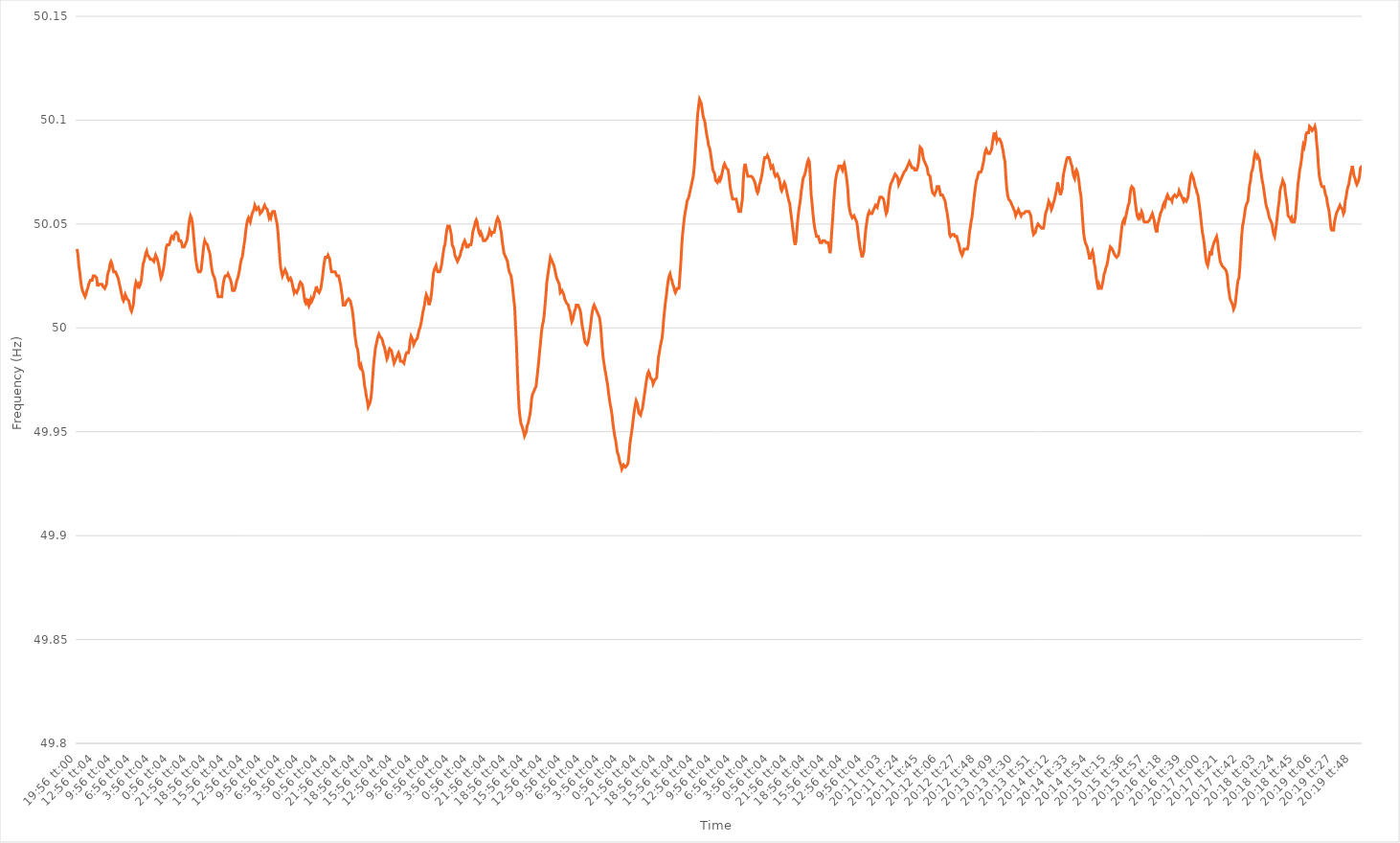
| Category | Series 0 |
|---|---|
| 0.8305555555555556 | 50.038 |
| 0.8305671296296296 | 50.035 |
| 0.8305787037037037 | 50.03 |
| 0.8305902777777777 | 50.027 |
| 0.8306018518518519 | 50.023 |
| 0.872268518518518 | 50.02 |
| 0.913935185185185 | 50.018 |
| 0.955601851851852 | 50.017 |
| 0.997268518518518 | 50.016 |
| 1900-01-01 00:56:04 | 50.015 |
| 1900-01-01 01:56:04 | 50.016 |
| 1900-01-01 02:56:04 | 50.018 |
| 1900-01-01 03:56:04 | 50.019 |
| 1900-01-01 04:56:04 | 50.021 |
| 1900-01-01 05:56:04 | 50.022 |
| 1900-01-01 06:56:04 | 50.023 |
| 1900-01-01 07:56:04 | 50.023 |
| 1900-01-01 08:56:04 | 50.023 |
| 1900-01-01 09:56:04 | 50.025 |
| 1900-01-01 10:56:04 | 50.025 |
| 1900-01-01 11:56:04 | 50.025 |
| 1900-01-01 12:56:04 | 50.025 |
| 1900-01-01 13:56:04 | 50.024 |
| 1900-01-01 14:56:04 | 50.02 |
| 1900-01-01 15:56:04 | 50.021 |
| 1900-01-01 16:56:04 | 50.021 |
| 1900-01-01 17:56:04 | 50.021 |
| 1900-01-01 18:56:04 | 50.021 |
| 1900-01-01 19:56:04 | 50.021 |
| 1900-01-01 20:56:04 | 50.02 |
| 1900-01-01 21:56:04 | 50.02 |
| 1900-01-01 22:56:04 | 50.019 |
| 1900-01-01 23:56:04 | 50.02 |
| 1900-01-02 00:56:04 | 50.021 |
| 1900-01-02 01:56:04 | 50.025 |
| 1900-01-02 02:56:04 | 50.027 |
| 1900-01-02 03:56:04 | 50.028 |
| 1900-01-02 04:56:04 | 50.031 |
| 1900-01-02 05:56:04 | 50.032 |
| 1900-01-02 06:56:04 | 50.031 |
| 1900-01-02 07:56:04 | 50.029 |
| 1900-01-02 08:56:04 | 50.027 |
| 1900-01-02 09:56:04 | 50.027 |
| 1900-01-02 10:56:04 | 50.027 |
| 1900-01-02 11:56:04 | 50.026 |
| 1900-01-02 12:56:04 | 50.025 |
| 1900-01-02 13:56:04 | 50.024 |
| 1900-01-02 14:56:04 | 50.022 |
| 1900-01-02 15:56:04 | 50.02 |
| 1900-01-02 16:56:04 | 50.018 |
| 1900-01-02 17:56:04 | 50.016 |
| 1900-01-02 18:56:04 | 50.014 |
| 1900-01-02 19:56:04 | 50.013 |
| 1900-01-02 20:56:04 | 50.014 |
| 1900-01-02 21:56:04 | 50.016 |
| 1900-01-02 22:56:04 | 50.015 |
| 1900-01-02 23:56:04 | 50.014 |
| 1900-01-03 00:56:04 | 50.014 |
| 1900-01-03 01:56:04 | 50.013 |
| 1900-01-03 02:56:04 | 50.011 |
| 1900-01-03 03:56:04 | 50.009 |
| 1900-01-03 04:56:04 | 50.008 |
| 1900-01-03 05:56:04 | 50.008 |
| 1900-01-03 06:56:04 | 50.011 |
| 1900-01-03 07:56:04 | 50.016 |
| 1900-01-03 08:56:04 | 50.02 |
| 1900-01-03 09:56:04 | 50.022 |
| 1900-01-03 10:56:04 | 50.022 |
| 1900-01-03 11:56:04 | 50.02 |
| 1900-01-03 12:56:04 | 50.021 |
| 1900-01-03 13:56:04 | 50.02 |
| 1900-01-03 14:56:04 | 50.021 |
| 1900-01-03 15:56:04 | 50.023 |
| 1900-01-03 16:56:04 | 50.027 |
| 1900-01-03 17:56:04 | 50.031 |
| 1900-01-03 18:56:04 | 50.032 |
| 1900-01-03 19:56:04 | 50.034 |
| 1900-01-03 20:56:04 | 50.036 |
| 1900-01-03 21:56:04 | 50.037 |
| 1900-01-03 22:56:04 | 50.035 |
| 1900-01-03 23:56:04 | 50.035 |
| 1900-01-04 00:56:04 | 50.034 |
| 1900-01-04 01:56:04 | 50.033 |
| 1900-01-04 02:56:04 | 50.033 |
| 1900-01-04 03:56:04 | 50.033 |
| 1900-01-04 04:56:04 | 50.033 |
| 1900-01-04 05:56:04 | 50.032 |
| 1900-01-04 06:56:04 | 50.032 |
| 1900-01-04 07:56:04 | 50.035 |
| 1900-01-04 08:56:04 | 50.034 |
| 1900-01-04 09:56:04 | 50.033 |
| 1900-01-04 10:56:04 | 50.031 |
| 1900-01-04 11:56:04 | 50.029 |
| 1900-01-04 12:56:04 | 50.026 |
| 1900-01-04 13:56:04 | 50.024 |
| 1900-01-04 14:56:04 | 50.025 |
| 1900-01-04 15:56:04 | 50.027 |
| 1900-01-04 16:56:04 | 50.029 |
| 1900-01-04 17:56:04 | 50.032 |
| 1900-01-04 18:56:04 | 50.036 |
| 1900-01-04 19:56:04 | 50.039 |
| 1900-01-04 20:56:04 | 50.04 |
| 1900-01-04 21:56:04 | 50.04 |
| 1900-01-04 22:56:04 | 50.04 |
| 1900-01-04 23:56:04 | 50.041 |
| 1900-01-05 00:56:04 | 50.043 |
| 1900-01-05 01:56:04 | 50.044 |
| 1900-01-05 02:56:04 | 50.044 |
| 1900-01-05 03:56:04 | 50.043 |
| 1900-01-05 04:56:04 | 50.045 |
| 1900-01-05 05:56:04 | 50.045 |
| 1900-01-05 06:56:04 | 50.046 |
| 1900-01-05 07:56:04 | 50.046 |
| 1900-01-05 08:56:04 | 50.045 |
| 1900-01-05 09:56:04 | 50.042 |
| 1900-01-05 10:56:04 | 50.042 |
| 1900-01-05 11:56:04 | 50.042 |
| 1900-01-05 12:56:04 | 50.041 |
| 1900-01-05 13:56:04 | 50.039 |
| 1900-01-05 14:56:04 | 50.039 |
| 1900-01-05 15:56:04 | 50.039 |
| 1900-01-05 16:56:04 | 50.039 |
| 1900-01-05 17:56:04 | 50.041 |
| 1900-01-05 18:56:04 | 50.042 |
| 1900-01-05 19:56:04 | 50.045 |
| 1900-01-05 20:56:04 | 50.049 |
| 1900-01-05 21:56:04 | 50.052 |
| 1900-01-05 22:56:04 | 50.054 |
| 1900-01-05 23:56:04 | 50.053 |
| 1900-01-06 00:56:04 | 50.051 |
| 1900-01-06 01:56:04 | 50.047 |
| 1900-01-06 02:56:04 | 50.042 |
| 1900-01-06 03:56:04 | 50.037 |
| 1900-01-06 04:56:04 | 50.033 |
| 1900-01-06 05:56:04 | 50.03 |
| 1900-01-06 06:56:04 | 50.028 |
| 1900-01-06 07:56:04 | 50.027 |
| 1900-01-06 08:56:04 | 50.027 |
| 1900-01-06 09:56:04 | 50.027 |
| 1900-01-06 10:56:04 | 50.028 |
| 1900-01-06 11:56:04 | 50.032 |
| 1900-01-06 12:56:04 | 50.036 |
| 1900-01-06 13:56:04 | 50.04 |
| 1900-01-06 14:56:04 | 50.042 |
| 1900-01-06 15:56:04 | 50.041 |
| 1900-01-06 16:56:04 | 50.041 |
| 1900-01-06 17:56:04 | 50.04 |
| 1900-01-06 18:56:04 | 50.038 |
| 1900-01-06 19:56:04 | 50.037 |
| 1900-01-06 20:56:04 | 50.035 |
| 1900-01-06 21:56:04 | 50.031 |
| 1900-01-06 22:56:04 | 50.028 |
| 1900-01-06 23:56:04 | 50.026 |
| 1900-01-07 00:56:04 | 50.026 |
| 1900-01-07 01:56:04 | 50.024 |
| 1900-01-07 02:56:04 | 50.022 |
| 1900-01-07 03:56:04 | 50.019 |
| 1900-01-07 04:56:04 | 50.017 |
| 1900-01-07 05:56:04 | 50.015 |
| 1900-01-07 06:56:04 | 50.015 |
| 1900-01-07 07:56:04 | 50.015 |
| 1900-01-07 08:56:04 | 50.015 |
| 1900-01-07 09:56:04 | 50.015 |
| 1900-01-07 10:56:04 | 50.019 |
| 1900-01-07 11:56:04 | 50.022 |
| 1900-01-07 12:56:04 | 50.024 |
| 1900-01-07 13:56:04 | 50.025 |
| 1900-01-07 14:56:04 | 50.025 |
| 1900-01-07 15:56:04 | 50.025 |
| 1900-01-07 16:56:04 | 50.026 |
| 1900-01-07 17:56:04 | 50.025 |
| 1900-01-07 18:56:04 | 50.024 |
| 1900-01-07 19:56:04 | 50.023 |
| 1900-01-07 20:56:04 | 50.021 |
| 1900-01-07 21:56:04 | 50.018 |
| 1900-01-07 22:56:04 | 50.018 |
| 1900-01-07 23:56:04 | 50.018 |
| 1900-01-08 00:56:04 | 50.019 |
| 1900-01-08 01:56:04 | 50.021 |
| 1900-01-08 02:56:04 | 50.023 |
| 1900-01-08 03:56:04 | 50.024 |
| 1900-01-08 04:56:04 | 50.026 |
| 1900-01-08 05:56:04 | 50.028 |
| 1900-01-08 06:56:04 | 50.031 |
| 1900-01-08 07:56:04 | 50.033 |
| 1900-01-08 08:56:04 | 50.034 |
| 1900-01-08 09:56:04 | 50.037 |
| 1900-01-08 10:56:04 | 50.04 |
| 1900-01-08 11:56:04 | 50.043 |
| 1900-01-08 12:56:04 | 50.047 |
| 1900-01-08 13:56:04 | 50.05 |
| 1900-01-08 14:56:04 | 50.052 |
| 1900-01-08 15:56:04 | 50.053 |
| 1900-01-08 16:56:04 | 50.052 |
| 1900-01-08 17:56:04 | 50.051 |
| 1900-01-08 18:56:04 | 50.053 |
| 1900-01-08 19:56:04 | 50.055 |
| 1900-01-08 20:56:04 | 50.056 |
| 1900-01-08 21:56:04 | 50.057 |
| 1900-01-08 22:56:04 | 50.059 |
| 1900-01-08 23:56:04 | 50.058 |
| 1900-01-09 00:56:04 | 50.057 |
| 1900-01-09 01:56:04 | 50.057 |
| 1900-01-09 02:56:04 | 50.058 |
| 1900-01-09 03:56:04 | 50.057 |
| 1900-01-09 04:56:04 | 50.055 |
| 1900-01-09 05:56:04 | 50.055 |
| 1900-01-09 06:56:04 | 50.056 |
| 1900-01-09 07:56:04 | 50.057 |
| 1900-01-09 08:56:04 | 50.058 |
| 1900-01-09 09:56:04 | 50.059 |
| 1900-01-09 10:56:04 | 50.058 |
| 1900-01-09 11:56:04 | 50.058 |
| 1900-01-09 12:56:04 | 50.057 |
| 1900-01-09 13:56:04 | 50.055 |
| 1900-01-09 14:56:04 | 50.053 |
| 1900-01-09 15:56:04 | 50.054 |
| 1900-01-09 16:56:04 | 50.053 |
| 1900-01-09 17:56:04 | 50.055 |
| 1900-01-09 18:56:04 | 50.056 |
| 1900-01-09 19:56:04 | 50.056 |
| 1900-01-09 20:56:04 | 50.056 |
| 1900-01-09 21:56:04 | 50.054 |
| 1900-01-09 22:56:04 | 50.052 |
| 1900-01-09 23:56:04 | 50.05 |
| 1900-01-10 00:56:04 | 50.046 |
| 1900-01-10 01:56:04 | 50.04 |
| 1900-01-10 02:56:04 | 50.034 |
| 1900-01-10 03:56:04 | 50.029 |
| 1900-01-10 04:56:04 | 50.027 |
| 1900-01-10 05:56:04 | 50.025 |
| 1900-01-10 06:56:04 | 50.025 |
| 1900-01-10 07:56:04 | 50.027 |
| 1900-01-10 08:56:04 | 50.028 |
| 1900-01-10 09:56:04 | 50.027 |
| 1900-01-10 10:56:04 | 50.026 |
| 1900-01-10 11:56:04 | 50.024 |
| 1900-01-10 12:56:04 | 50.023 |
| 1900-01-10 13:56:04 | 50.023 |
| 1900-01-10 14:56:04 | 50.024 |
| 1900-01-10 15:56:04 | 50.023 |
| 1900-01-10 16:56:04 | 50.021 |
| 1900-01-10 17:56:04 | 50.019 |
| 1900-01-10 18:56:04 | 50.017 |
| 1900-01-10 19:56:04 | 50.018 |
| 1900-01-10 20:56:04 | 50.018 |
| 1900-01-10 21:56:04 | 50.017 |
| 1900-01-10 22:56:04 | 50.017 |
| 1900-01-10 23:56:04 | 50.019 |
| 1900-01-11 00:56:04 | 50.021 |
| 1900-01-11 01:56:04 | 50.022 |
| 1900-01-11 02:56:04 | 50.022 |
| 1900-01-11 03:56:04 | 50.021 |
| 1900-01-11 04:56:04 | 50.019 |
| 1900-01-11 05:56:04 | 50.016 |
| 1900-01-11 06:56:04 | 50.013 |
| 1900-01-11 07:56:04 | 50.012 |
| 1900-01-11 08:56:04 | 50.013 |
| 1900-01-11 09:56:04 | 50.012 |
| 1900-01-11 10:56:04 | 50.014 |
| 1900-01-11 11:56:04 | 50.011 |
| 1900-01-11 12:56:04 | 50.012 |
| 1900-01-11 13:56:04 | 50.014 |
| 1900-01-11 14:56:04 | 50.013 |
| 1900-01-11 15:56:04 | 50.014 |
| 1900-01-11 16:56:04 | 50.015 |
| 1900-01-11 17:56:04 | 50.017 |
| 1900-01-11 18:56:04 | 50.018 |
| 1900-01-11 19:56:04 | 50.02 |
| 1900-01-11 20:56:04 | 50.018 |
| 1900-01-11 21:56:04 | 50.018 |
| 1900-01-11 22:56:04 | 50.017 |
| 1900-01-11 23:56:04 | 50.018 |
| 1900-01-12 00:56:04 | 50.019 |
| 1900-01-12 01:56:04 | 50.022 |
| 1900-01-12 02:56:04 | 50.025 |
| 1900-01-12 03:56:04 | 50.029 |
| 1900-01-12 04:56:04 | 50.032 |
| 1900-01-12 05:56:04 | 50.034 |
| 1900-01-12 06:56:04 | 50.034 |
| 1900-01-12 07:56:04 | 50.034 |
| 1900-01-12 08:56:04 | 50.035 |
| 1900-01-12 09:56:04 | 50.034 |
| 1900-01-12 10:56:04 | 50.033 |
| 1900-01-12 11:56:04 | 50.029 |
| 1900-01-12 12:56:04 | 50.027 |
| 1900-01-12 13:56:04 | 50.027 |
| 1900-01-12 14:56:04 | 50.027 |
| 1900-01-12 15:56:04 | 50.027 |
| 1900-01-12 16:56:04 | 50.027 |
| 1900-01-12 17:56:04 | 50.026 |
| 1900-01-12 18:56:04 | 50.025 |
| 1900-01-12 19:56:04 | 50.025 |
| 1900-01-12 20:56:04 | 50.025 |
| 1900-01-12 21:56:04 | 50.023 |
| 1900-01-12 22:56:04 | 50.021 |
| 1900-01-12 23:56:04 | 50.018 |
| 1900-01-13 00:56:04 | 50.015 |
| 1900-01-13 01:56:04 | 50.011 |
| 1900-01-13 02:56:04 | 50.011 |
| 1900-01-13 03:56:04 | 50.011 |
| 1900-01-13 04:56:04 | 50.012 |
| 1900-01-13 05:56:04 | 50.013 |
| 1900-01-13 06:56:04 | 50.013 |
| 1900-01-13 07:56:04 | 50.014 |
| 1900-01-13 08:56:04 | 50.014 |
| 1900-01-13 09:56:04 | 50.013 |
| 1900-01-13 10:56:04 | 50.011 |
| 1900-01-13 11:56:04 | 50.009 |
| 1900-01-13 12:56:04 | 50.006 |
| 1900-01-13 13:56:04 | 50.002 |
| 1900-01-13 14:56:04 | 49.997 |
| 1900-01-13 15:56:04 | 49.994 |
| 1900-01-13 16:56:04 | 49.991 |
| 1900-01-13 17:56:04 | 49.99 |
| 1900-01-13 18:56:04 | 49.987 |
| 1900-01-13 19:56:04 | 49.982 |
| 1900-01-13 20:56:04 | 49.981 |
| 1900-01-13 21:56:04 | 49.982 |
| 1900-01-13 22:56:04 | 49.98 |
| 1900-01-13 23:56:04 | 49.979 |
| 1900-01-14 00:56:04 | 49.976 |
| 1900-01-14 01:56:04 | 49.972 |
| 1900-01-14 02:56:04 | 49.97 |
| 1900-01-14 03:56:04 | 49.967 |
| 1900-01-14 04:56:04 | 49.965 |
| 1900-01-14 05:56:04 | 49.962 |
| 1900-01-14 06:56:04 | 49.962 |
| 1900-01-14 07:56:04 | 49.964 |
| 1900-01-14 08:56:04 | 49.966 |
| 1900-01-14 09:56:04 | 49.97 |
| 1900-01-14 10:56:04 | 49.976 |
| 1900-01-14 11:56:04 | 49.982 |
| 1900-01-14 12:56:04 | 49.986 |
| 1900-01-14 13:56:04 | 49.99 |
| 1900-01-14 14:56:04 | 49.992 |
| 1900-01-14 15:56:04 | 49.994 |
| 1900-01-14 16:56:04 | 49.996 |
| 1900-01-14 17:56:04 | 49.997 |
| 1900-01-14 18:56:04 | 49.996 |
| 1900-01-14 19:56:04 | 49.996 |
| 1900-01-14 20:56:04 | 49.995 |
| 1900-01-14 21:56:04 | 49.994 |
| 1900-01-14 22:56:04 | 49.992 |
| 1900-01-14 23:56:04 | 49.991 |
| 1900-01-15 00:56:04 | 49.989 |
| 1900-01-15 01:56:04 | 49.987 |
| 1900-01-15 02:56:04 | 49.985 |
| 1900-01-15 03:56:04 | 49.986 |
| 1900-01-15 04:56:04 | 49.989 |
| 1900-01-15 05:56:04 | 49.99 |
| 1900-01-15 06:56:04 | 49.99 |
| 1900-01-15 07:56:04 | 49.989 |
| 1900-01-15 08:56:04 | 49.987 |
| 1900-01-15 09:56:04 | 49.985 |
| 1900-01-15 10:56:04 | 49.983 |
| 1900-01-15 11:56:04 | 49.984 |
| 1900-01-15 12:56:04 | 49.985 |
| 1900-01-15 13:56:04 | 49.985 |
| 1900-01-15 14:56:04 | 49.987 |
| 1900-01-15 15:56:04 | 49.988 |
| 1900-01-15 16:56:04 | 49.987 |
| 1900-01-15 17:56:04 | 49.984 |
| 1900-01-15 18:56:04 | 49.984 |
| 1900-01-15 19:56:04 | 49.984 |
| 1900-01-15 20:56:04 | 49.984 |
| 1900-01-15 21:56:04 | 49.983 |
| 1900-01-15 22:56:04 | 49.985 |
| 1900-01-15 23:56:04 | 49.987 |
| 1900-01-16 00:56:04 | 49.988 |
| 1900-01-16 01:56:04 | 49.988 |
| 1900-01-16 02:56:04 | 49.988 |
| 1900-01-16 03:56:04 | 49.99 |
| 1900-01-16 04:56:04 | 49.994 |
| 1900-01-16 05:56:04 | 49.996 |
| 1900-01-16 06:56:04 | 49.995 |
| 1900-01-16 07:56:04 | 49.994 |
| 1900-01-16 08:56:04 | 49.992 |
| 1900-01-16 09:56:04 | 49.992 |
| 1900-01-16 10:56:04 | 49.994 |
| 1900-01-16 11:56:04 | 49.994 |
| 1900-01-16 12:56:04 | 49.995 |
| 1900-01-16 13:56:04 | 49.997 |
| 1900-01-16 14:56:04 | 49.999 |
| 1900-01-16 15:56:04 | 50 |
| 1900-01-16 16:56:04 | 50.002 |
| 1900-01-16 17:56:04 | 50.004 |
| 1900-01-16 18:56:04 | 50.007 |
| 1900-01-16 19:56:04 | 50.009 |
| 1900-01-16 20:56:04 | 50.011 |
| 1900-01-16 21:56:04 | 50.014 |
| 1900-01-16 22:56:04 | 50.016 |
| 1900-01-16 23:56:04 | 50.015 |
| 1900-01-17 00:56:04 | 50.014 |
| 1900-01-17 01:56:04 | 50.011 |
| 1900-01-17 02:56:04 | 50.011 |
| 1900-01-17 03:56:04 | 50.014 |
| 1900-01-17 04:56:04 | 50.017 |
| 1900-01-17 05:56:04 | 50.022 |
| 1900-01-17 06:56:04 | 50.026 |
| 1900-01-17 07:56:04 | 50.028 |
| 1900-01-17 08:56:04 | 50.029 |
| 1900-01-17 09:56:04 | 50.03 |
| 1900-01-17 10:56:04 | 50.028 |
| 1900-01-17 11:56:04 | 50.027 |
| 1900-01-17 12:56:04 | 50.027 |
| 1900-01-17 13:56:04 | 50.027 |
| 1900-01-17 14:56:04 | 50.028 |
| 1900-01-17 15:56:04 | 50.03 |
| 1900-01-17 16:56:04 | 50.033 |
| 1900-01-17 17:56:04 | 50.036 |
| 1900-01-17 18:56:04 | 50.039 |
| 1900-01-17 19:56:04 | 50.04 |
| 1900-01-17 20:56:04 | 50.044 |
| 1900-01-17 21:56:04 | 50.047 |
| 1900-01-17 22:56:04 | 50.049 |
| 1900-01-17 23:56:04 | 50.049 |
| 1900-01-18 00:56:04 | 50.049 |
| 1900-01-18 01:56:04 | 50.047 |
| 1900-01-18 02:56:04 | 50.045 |
| 1900-01-18 03:56:04 | 50.04 |
| 1900-01-18 04:56:04 | 50.04 |
| 1900-01-18 05:56:04 | 50.038 |
| 1900-01-18 06:56:04 | 50.035 |
| 1900-01-18 07:56:04 | 50.034 |
| 1900-01-18 08:56:04 | 50.033 |
| 1900-01-18 09:56:04 | 50.032 |
| 1900-01-18 10:56:04 | 50.033 |
| 1900-01-18 11:56:04 | 50.034 |
| 1900-01-18 12:56:04 | 50.035 |
| 1900-01-18 13:56:04 | 50.037 |
| 1900-01-18 14:56:04 | 50.038 |
| 1900-01-18 15:56:04 | 50.04 |
| 1900-01-18 16:56:04 | 50.041 |
| 1900-01-18 17:56:04 | 50.042 |
| 1900-01-18 18:56:04 | 50.041 |
| 1900-01-18 19:56:04 | 50.039 |
| 1900-01-18 20:56:04 | 50.039 |
| 1900-01-18 21:56:04 | 50.039 |
| 1900-01-18 22:56:04 | 50.04 |
| 1900-01-18 23:56:04 | 50.04 |
| 1900-01-19 00:56:04 | 50.04 |
| 1900-01-19 01:56:04 | 50.042 |
| 1900-01-19 02:56:04 | 50.046 |
| 1900-01-19 03:56:04 | 50.046 |
| 1900-01-19 04:56:04 | 50.049 |
| 1900-01-19 05:56:04 | 50.051 |
| 1900-01-19 06:56:04 | 50.052 |
| 1900-01-19 07:56:04 | 50.051 |
| 1900-01-19 08:56:04 | 50.048 |
| 1900-01-19 09:56:04 | 50.046 |
| 1900-01-19 10:56:04 | 50.045 |
| 1900-01-19 11:56:04 | 50.046 |
| 1900-01-19 12:56:04 | 50.045 |
| 1900-01-19 13:56:04 | 50.045 |
| 1900-01-19 14:56:04 | 50.042 |
| 1900-01-19 15:56:04 | 50.042 |
| 1900-01-19 16:56:04 | 50.042 |
| 1900-01-19 17:56:04 | 50.042 |
| 1900-01-19 18:56:04 | 50.043 |
| 1900-01-19 19:56:04 | 50.044 |
| 1900-01-19 20:56:04 | 50.045 |
| 1900-01-19 21:56:04 | 50.047 |
| 1900-01-19 22:56:04 | 50.046 |
| 1900-01-19 23:56:04 | 50.045 |
| 1900-01-20 00:56:04 | 50.046 |
| 1900-01-20 01:56:04 | 50.046 |
| 1900-01-20 02:56:04 | 50.046 |
| 1900-01-20 03:56:04 | 50.048 |
| 1900-01-20 04:56:04 | 50.05 |
| 1900-01-20 05:56:04 | 50.052 |
| 1900-01-20 06:56:04 | 50.053 |
| 1900-01-20 07:56:04 | 50.053 |
| 1900-01-20 08:56:04 | 50.051 |
| 1900-01-20 09:56:04 | 50.048 |
| 1900-01-20 10:56:04 | 50.046 |
| 1900-01-20 11:56:04 | 50.042 |
| 1900-01-20 12:56:04 | 50.039 |
| 1900-01-20 13:56:04 | 50.036 |
| 1900-01-20 14:56:04 | 50.035 |
| 1900-01-20 15:56:04 | 50.034 |
| 1900-01-20 16:56:04 | 50.033 |
| 1900-01-20 17:56:04 | 50.032 |
| 1900-01-20 18:56:04 | 50.029 |
| 1900-01-20 19:56:04 | 50.027 |
| 1900-01-20 20:56:04 | 50.027 |
| 1900-01-20 21:56:04 | 50.025 |
| 1900-01-20 22:56:04 | 50.022 |
| 1900-01-20 23:56:04 | 50.018 |
| 1900-01-21 00:56:04 | 50.014 |
| 1900-01-21 01:56:04 | 50.01 |
| 1900-01-21 02:56:04 | 50.001 |
| 1900-01-21 03:56:04 | 49.992 |
| 1900-01-21 04:56:04 | 49.98 |
| 1900-01-21 05:56:04 | 49.969 |
| 1900-01-21 06:56:04 | 49.961 |
| 1900-01-21 07:56:04 | 49.957 |
| 1900-01-21 08:56:04 | 49.954 |
| 1900-01-21 09:56:04 | 49.953 |
| 1900-01-21 10:56:04 | 49.953 |
| 1900-01-21 11:56:04 | 49.95 |
| 1900-01-21 12:56:04 | 49.948 |
| 1900-01-21 13:56:04 | 49.948 |
| 1900-01-21 14:56:04 | 49.95 |
| 1900-01-21 15:56:04 | 49.953 |
| 1900-01-21 16:56:04 | 49.954 |
| 1900-01-21 17:56:04 | 49.956 |
| 1900-01-21 18:56:04 | 49.958 |
| 1900-01-21 19:56:04 | 49.961 |
| 1900-01-21 20:56:04 | 49.966 |
| 1900-01-21 21:56:04 | 49.968 |
| 1900-01-21 22:56:04 | 49.969 |
| 1900-01-21 23:56:04 | 49.97 |
| 1900-01-22 00:56:04 | 49.971 |
| 1900-01-22 01:56:04 | 49.972 |
| 1900-01-22 02:56:04 | 49.976 |
| 1900-01-22 03:56:04 | 49.98 |
| 1900-01-22 04:56:04 | 49.984 |
| 1900-01-22 05:56:04 | 49.989 |
| 1900-01-22 06:56:04 | 49.993 |
| 1900-01-22 07:56:04 | 49.998 |
| 1900-01-22 08:56:04 | 50.001 |
| 1900-01-22 09:56:04 | 50.003 |
| 1900-01-22 10:56:04 | 50.006 |
| 1900-01-22 11:56:04 | 50.011 |
| 1900-01-22 12:56:04 | 50.016 |
| 1900-01-22 13:56:04 | 50.022 |
| 1900-01-22 14:56:04 | 50.025 |
| 1900-01-22 15:56:04 | 50.028 |
| 1900-01-22 16:56:04 | 50.031 |
| 1900-01-22 17:56:04 | 50.034 |
| 1900-01-22 18:56:04 | 50.033 |
| 1900-01-22 19:56:04 | 50.032 |
| 1900-01-22 20:56:04 | 50.031 |
| 1900-01-22 21:56:04 | 50.03 |
| 1900-01-22 22:56:04 | 50.028 |
| 1900-01-22 23:56:04 | 50.026 |
| 1900-01-23 00:56:04 | 50.024 |
| 1900-01-23 01:56:04 | 50.023 |
| 1900-01-23 02:56:04 | 50.022 |
| 1900-01-23 03:56:04 | 50.021 |
| 1900-01-23 04:56:04 | 50.017 |
| 1900-01-23 05:56:04 | 50.017 |
| 1900-01-23 06:56:04 | 50.018 |
| 1900-01-23 07:56:04 | 50.018 |
| 1900-01-23 08:56:04 | 50.016 |
| 1900-01-23 09:56:04 | 50.014 |
| 1900-01-23 10:56:04 | 50.013 |
| 1900-01-23 11:56:04 | 50.012 |
| 1900-01-23 12:56:04 | 50.012 |
| 1900-01-23 13:56:04 | 50.011 |
| 1900-01-23 14:56:04 | 50.009 |
| 1900-01-23 15:56:04 | 50.008 |
| 1900-01-23 16:56:04 | 50.005 |
| 1900-01-23 17:56:04 | 50.003 |
| 1900-01-23 18:56:04 | 50.004 |
| 1900-01-23 19:56:04 | 50.006 |
| 1900-01-23 20:56:04 | 50.008 |
| 1900-01-23 21:56:04 | 50.009 |
| 1900-01-23 22:56:04 | 50.011 |
| 1900-01-23 23:56:04 | 50.011 |
| 1900-01-24 00:56:04 | 50.011 |
| 1900-01-24 01:56:04 | 50.011 |
| 1900-01-24 02:56:04 | 50.009 |
| 1900-01-24 03:56:04 | 50.007 |
| 1900-01-24 04:56:04 | 50.003 |
| 1900-01-24 05:56:04 | 50 |
| 1900-01-24 06:56:04 | 49.998 |
| 1900-01-24 07:56:04 | 49.995 |
| 1900-01-24 08:56:04 | 49.993 |
| 1900-01-24 09:56:04 | 49.993 |
| 1900-01-24 10:56:04 | 49.992 |
| 1900-01-24 11:56:04 | 49.993 |
| 1900-01-24 12:56:04 | 49.995 |
| 1900-01-24 13:56:04 | 49.998 |
| 1900-01-24 14:56:04 | 50.001 |
| 1900-01-24 15:56:04 | 50.005 |
| 1900-01-24 16:56:04 | 50.008 |
| 1900-01-24 17:56:04 | 50.01 |
| 1900-01-24 18:56:04 | 50.011 |
| 1900-01-24 19:56:04 | 50.01 |
| 1900-01-24 20:56:04 | 50.01 |
| 1900-01-24 21:56:04 | 50.008 |
| 1900-01-24 22:56:04 | 50.007 |
| 1900-01-24 23:56:04 | 50.006 |
| 1900-01-25 00:56:04 | 50.005 |
| 1900-01-25 01:56:04 | 50.002 |
| 1900-01-25 02:56:04 | 49.997 |
| 1900-01-25 03:56:04 | 49.991 |
| 1900-01-25 04:56:04 | 49.986 |
| 1900-01-25 05:56:04 | 49.983 |
| 1900-01-25 06:56:04 | 49.98 |
| 1900-01-25 07:56:04 | 49.978 |
| 1900-01-25 08:56:04 | 49.975 |
| 1900-01-25 09:56:04 | 49.973 |
| 1900-01-25 10:56:04 | 49.969 |
| 1900-01-25 11:56:04 | 49.966 |
| 1900-01-25 12:56:04 | 49.963 |
| 1900-01-25 13:56:04 | 49.961 |
| 1900-01-25 14:56:04 | 49.958 |
| 1900-01-25 15:56:04 | 49.954 |
| 1900-01-25 16:56:04 | 49.951 |
| 1900-01-25 17:56:04 | 49.948 |
| 1900-01-25 18:56:04 | 49.946 |
| 1900-01-25 19:56:04 | 49.943 |
| 1900-01-25 20:56:04 | 49.94 |
| 1900-01-25 21:56:04 | 49.939 |
| 1900-01-25 22:56:04 | 49.937 |
| 1900-01-25 23:56:04 | 49.935 |
| 1900-01-26 00:56:04 | 49.934 |
| 1900-01-26 01:56:04 | 49.932 |
| 1900-01-26 02:56:04 | 49.933 |
| 1900-01-26 03:56:04 | 49.934 |
| 1900-01-26 04:56:04 | 49.934 |
| 1900-01-26 05:56:04 | 49.933 |
| 1900-01-26 06:56:04 | 49.933 |
| 1900-01-26 07:56:04 | 49.934 |
| 1900-01-26 08:56:04 | 49.935 |
| 1900-01-26 09:56:04 | 49.939 |
| 1900-01-26 10:56:04 | 49.944 |
| 1900-01-26 11:56:04 | 49.947 |
| 1900-01-26 12:56:04 | 49.95 |
| 1900-01-26 13:56:04 | 49.953 |
| 1900-01-26 14:56:04 | 49.957 |
| 1900-01-26 15:56:04 | 49.96 |
| 1900-01-26 16:56:04 | 49.963 |
| 1900-01-26 17:56:04 | 49.965 |
| 1900-01-26 18:56:04 | 49.964 |
| 1900-01-26 19:56:04 | 49.962 |
| 1900-01-26 20:56:04 | 49.959 |
| 1900-01-26 21:56:04 | 49.959 |
| 1900-01-26 22:56:04 | 49.958 |
| 1900-01-26 23:56:04 | 49.96 |
| 1900-01-27 00:56:04 | 49.961 |
| 1900-01-27 01:56:04 | 49.964 |
| 1900-01-27 02:56:04 | 49.967 |
| 1900-01-27 03:56:04 | 49.97 |
| 1900-01-27 04:56:04 | 49.973 |
| 1900-01-27 05:56:04 | 49.976 |
| 1900-01-27 06:56:04 | 49.978 |
| 1900-01-27 07:56:04 | 49.979 |
| 1900-01-27 08:56:04 | 49.978 |
| 1900-01-27 09:56:04 | 49.976 |
| 1900-01-27 10:56:04 | 49.976 |
| 1900-01-27 11:56:04 | 49.975 |
| 1900-01-27 12:56:04 | 49.973 |
| 1900-01-27 13:56:04 | 49.973 |
| 1900-01-27 14:56:04 | 49.975 |
| 1900-01-27 15:56:04 | 49.975 |
| 1900-01-27 16:56:04 | 49.976 |
| 1900-01-27 17:56:04 | 49.981 |
| 1900-01-27 18:56:04 | 49.986 |
| 1900-01-27 19:56:04 | 49.988 |
| 1900-01-27 20:56:04 | 49.991 |
| 1900-01-27 21:56:04 | 49.993 |
| 1900-01-27 22:56:04 | 49.995 |
| 1900-01-27 23:56:04 | 49.999 |
| 1900-01-28 00:56:04 | 50.005 |
| 1900-01-28 01:56:04 | 50.009 |
| 1900-01-28 02:56:04 | 50.013 |
| 1900-01-28 03:56:04 | 50.016 |
| 1900-01-28 04:56:04 | 50.02 |
| 1900-01-28 05:56:04 | 50.023 |
| 1900-01-28 06:56:04 | 50.025 |
| 1900-01-28 07:56:04 | 50.026 |
| 1900-01-28 08:56:04 | 50.024 |
| 1900-01-28 09:56:04 | 50.023 |
| 1900-01-28 10:56:04 | 50.021 |
| 1900-01-28 11:56:04 | 50.02 |
| 1900-01-28 12:56:04 | 50.018 |
| 1900-01-28 13:56:04 | 50.017 |
| 1900-01-28 14:56:04 | 50.018 |
| 1900-01-28 15:56:04 | 50.019 |
| 1900-01-28 16:56:04 | 50.019 |
| 1900-01-28 17:56:04 | 50.019 |
| 1900-01-28 18:56:04 | 50.025 |
| 1900-01-28 19:56:04 | 50.031 |
| 1900-01-28 20:56:04 | 50.039 |
| 1900-01-28 21:56:04 | 50.045 |
| 1900-01-28 22:56:04 | 50.049 |
| 1900-01-28 23:56:04 | 50.053 |
| 1900-01-29 00:56:04 | 50.056 |
| 1900-01-29 01:56:04 | 50.058 |
| 1900-01-29 02:56:04 | 50.061 |
| 1900-01-29 03:56:04 | 50.062 |
| 1900-01-29 04:56:04 | 50.063 |
| 1900-01-29 05:56:04 | 50.065 |
| 1900-01-29 06:56:04 | 50.067 |
| 1900-01-29 07:56:04 | 50.069 |
| 1900-01-29 08:56:04 | 50.071 |
| 1900-01-29 09:56:04 | 50.073 |
| 1900-01-29 10:56:04 | 50.077 |
| 1900-01-29 11:56:04 | 50.083 |
| 1900-01-29 12:56:04 | 50.09 |
| 1900-01-29 13:56:04 | 50.097 |
| 1900-01-29 14:56:04 | 50.103 |
| 1900-01-29 15:56:04 | 50.107 |
| 1900-01-29 16:56:04 | 50.11 |
| 1900-01-29 17:56:04 | 50.11 |
| 1900-01-29 18:56:04 | 50.108 |
| 1900-01-29 19:56:04 | 50.105 |
| 1900-01-29 20:56:04 | 50.102 |
| 1900-01-29 21:56:04 | 50.102 |
| 1900-01-29 22:56:04 | 50.099 |
| 1900-01-29 23:56:04 | 50.096 |
| 1900-01-30 00:56:04 | 50.093 |
| 1900-01-30 01:56:04 | 50.091 |
| 1900-01-30 02:56:04 | 50.088 |
| 1900-01-30 03:56:04 | 50.087 |
| 1900-01-30 04:56:04 | 50.085 |
| 1900-01-30 05:56:04 | 50.082 |
| 1900-01-30 06:56:04 | 50.079 |
| 1900-01-30 07:56:04 | 50.076 |
| 1900-01-30 08:56:04 | 50.076 |
| 1900-01-30 09:56:04 | 50.074 |
| 1900-01-30 10:56:04 | 50.071 |
| 1900-01-30 11:56:04 | 50.071 |
| 1900-01-30 12:56:04 | 50.07 |
| 1900-01-30 13:56:04 | 50.071 |
| 1900-01-30 14:56:04 | 50.072 |
| 1900-01-30 15:56:04 | 50.071 |
| 1900-01-30 16:56:04 | 50.072 |
| 1900-01-30 17:56:04 | 50.074 |
| 1900-01-30 18:56:04 | 50.076 |
| 1900-01-30 19:56:04 | 50.078 |
| 1900-01-30 20:56:04 | 50.079 |
| 1900-01-30 21:56:04 | 50.078 |
| 1900-01-30 22:56:04 | 50.077 |
| 1900-01-30 23:56:04 | 50.077 |
| 1900-01-31 00:56:04 | 50.076 |
| 1900-01-31 01:56:04 | 50.073 |
| 1900-01-31 02:56:04 | 50.069 |
| 1900-01-31 03:56:04 | 50.066 |
| 1900-01-31 04:56:04 | 50.064 |
| 1900-01-31 05:56:04 | 50.062 |
| 1900-01-31 06:56:04 | 50.062 |
| 1900-01-31 07:56:04 | 50.062 |
| 1900-01-31 08:56:04 | 50.062 |
| 1900-01-31 09:56:04 | 50.062 |
| 1900-01-31 10:56:04 | 50.06 |
| 1900-01-31 11:56:04 | 50.058 |
| 1900-01-31 12:56:04 | 50.056 |
| 1900-01-31 13:56:04 | 50.056 |
| 1900-01-31 14:56:04 | 50.056 |
| 1900-01-31 15:56:04 | 50.056 |
| 1900-01-31 16:56:04 | 50.062 |
| 1900-01-31 17:56:04 | 50.071 |
| 1900-01-31 18:56:04 | 50.077 |
| 1900-01-31 19:56:04 | 50.079 |
| 1900-01-31 20:56:04 | 50.077 |
| 1900-01-31 21:56:04 | 50.075 |
| 1900-01-31 22:56:04 | 50.073 |
| 1900-01-31 23:56:04 | 50.073 |
| 1900-02-01 00:56:04 | 50.073 |
| 1900-02-01 01:56:04 | 50.073 |
| 1900-02-01 02:56:04 | 50.073 |
| 1900-02-01 03:56:04 | 50.073 |
| 1900-02-01 04:56:04 | 50.072 |
| 1900-02-01 05:56:04 | 50.071 |
| 1900-02-01 06:56:04 | 50.07 |
| 1900-02-01 07:56:04 | 50.068 |
| 1900-02-01 08:56:04 | 50.066 |
| 1900-02-01 09:56:04 | 50.065 |
| 1900-02-01 10:56:04 | 50.066 |
| 1900-02-01 11:56:04 | 50.069 |
| 1900-02-01 12:56:04 | 50.07 |
| 1900-02-01 13:56:04 | 50.072 |
| 1900-02-01 14:56:04 | 50.074 |
| 1900-02-01 15:56:04 | 50.077 |
| 1900-02-01 16:56:04 | 50.08 |
| 1900-02-01 17:56:04 | 50.082 |
| 1900-02-01 18:56:04 | 50.082 |
| 1900-02-01 19:56:04 | 50.082 |
| 1900-02-01 20:56:04 | 50.083 |
| 1900-02-01 21:56:04 | 50.083 |
| 1900-02-01 22:56:04 | 50.081 |
| 1900-02-01 23:56:04 | 50.079 |
| 1900-02-02 00:56:04 | 50.077 |
| 1900-02-02 01:56:04 | 50.077 |
| 1900-02-02 02:56:04 | 50.078 |
| 1900-02-02 03:56:04 | 50.076 |
| 1900-02-02 04:56:04 | 50.074 |
| 1900-02-02 05:56:04 | 50.073 |
| 1900-02-02 06:56:04 | 50.073 |
| 1900-02-02 07:56:04 | 50.074 |
| 1900-02-02 08:56:04 | 50.074 |
| 1900-02-02 09:56:04 | 50.072 |
| 1900-02-02 10:56:04 | 50.07 |
| 1900-02-02 11:56:04 | 50.067 |
| 1900-02-02 12:56:04 | 50.066 |
| 1900-02-02 13:56:04 | 50.067 |
| 1900-02-02 14:56:04 | 50.069 |
| 1900-02-02 15:56:04 | 50.07 |
| 1900-02-02 16:56:04 | 50.069 |
| 1900-02-02 17:56:04 | 50.067 |
| 1900-02-02 18:56:04 | 50.065 |
| 1900-02-02 19:56:04 | 50.063 |
| 1900-02-02 20:56:04 | 50.061 |
| 1900-02-02 21:56:04 | 50.06 |
| 1900-02-02 22:56:04 | 50.056 |
| 1900-02-02 23:56:04 | 50.053 |
| 1900-02-03 00:56:04 | 50.049 |
| 1900-02-03 01:56:04 | 50.046 |
| 1900-02-03 02:56:04 | 50.042 |
| 1900-02-03 03:56:04 | 50.04 |
| 1900-02-03 04:56:04 | 50.042 |
| 1900-02-03 05:56:04 | 50.047 |
| 1900-02-03 06:56:04 | 50.052 |
| 1900-02-03 07:56:04 | 50.056 |
| 1900-02-03 08:56:04 | 50.059 |
| 1900-02-03 09:56:04 | 50.062 |
| 1900-02-03 10:56:04 | 50.066 |
| 1900-02-03 11:56:04 | 50.069 |
| 1900-02-03 12:56:04 | 50.072 |
| 1900-02-03 13:56:04 | 50.073 |
| 1900-02-03 14:56:04 | 50.074 |
| 1900-02-03 15:56:04 | 50.076 |
| 1900-02-03 16:56:04 | 50.078 |
| 1900-02-03 17:56:04 | 50.08 |
| 1900-02-03 18:56:04 | 50.081 |
| 1900-02-03 19:56:04 | 50.08 |
| 1900-02-03 20:56:04 | 50.073 |
| 1900-02-03 21:56:04 | 50.064 |
| 1900-02-03 22:56:04 | 50.06 |
| 1900-02-03 23:56:04 | 50.055 |
| 1900-02-04 00:56:04 | 50.051 |
| 1900-02-04 01:56:04 | 50.048 |
| 1900-02-04 02:56:04 | 50.046 |
| 1900-02-04 03:56:04 | 50.044 |
| 1900-02-04 04:56:04 | 50.044 |
| 1900-02-04 05:56:04 | 50.044 |
| 1900-02-04 06:56:04 | 50.044 |
| 1900-02-04 07:56:04 | 50.041 |
| 1900-02-04 08:56:04 | 50.041 |
| 1900-02-04 09:56:04 | 50.041 |
| 1900-02-04 10:56:04 | 50.042 |
| 1900-02-04 11:56:04 | 50.042 |
| 1900-02-04 12:56:04 | 50.042 |
| 1900-02-04 13:56:04 | 50.042 |
| 1900-02-04 14:56:04 | 50.041 |
| 1900-02-04 15:56:04 | 50.041 |
| 1900-02-04 16:56:04 | 50.041 |
| 1900-02-04 17:56:04 | 50.039 |
| 1900-02-04 18:56:04 | 50.036 |
| 1900-02-04 19:56:04 | 50.039 |
| 1900-02-04 20:56:04 | 50.046 |
| 1900-02-04 21:56:04 | 50.052 |
| 1900-02-04 22:56:04 | 50.059 |
| 1900-02-04 23:56:04 | 50.065 |
| 1900-02-05 00:56:04 | 50.07 |
| 1900-02-05 01:56:04 | 50.073 |
| 1900-02-05 02:56:04 | 50.075 |
| 1900-02-05 03:56:04 | 50.076 |
| 1900-02-05 04:56:04 | 50.078 |
| 1900-02-05 05:56:04 | 50.078 |
| 1900-02-05 06:56:04 | 50.078 |
| 1900-02-05 07:56:04 | 50.077 |
| 1900-02-05 08:56:04 | 50.076 |
| 1900-02-05 09:56:04 | 50.078 |
| 1900-02-05 10:56:04 | 50.079 |
| 1900-02-05 11:56:04 | 50.077 |
| 1900-02-05 12:56:04 | 50.074 |
| 1900-02-05 13:56:04 | 50.071 |
| 1900-02-05 14:56:04 | 50.067 |
| 1900-02-05 15:56:04 | 50.06 |
| 1900-02-05 16:56:04 | 50.057 |
| 1900-02-05 17:56:04 | 50.055 |
| 1900-02-05 18:56:04 | 50.054 |
| 1900-02-05 19:56:04 | 50.053 |
| 1900-02-05 20:56:04 | 50.053 |
| 1900-02-05 21:56:04 | 50.054 |
| 1900-02-05 22:56:04 | 50.053 |
| 1900-02-05 23:56:04 | 50.052 |
| 1900-02-06 00:56:04 | 50.051 |
| 1900-02-06 01:56:04 | 50.048 |
| 1900-02-06 02:56:04 | 50.044 |
| 1900-02-06 03:56:04 | 50.041 |
| 1900-02-06 04:56:04 | 50.038 |
| 1900-02-06 05:56:04 | 50.036 |
| 1900-02-06 06:56:04 | 50.034 |
| 1900-02-06 07:56:04 | 50.034 |
| 1900-02-06 08:56:04 | 50.037 |
| 1900-02-06 09:56:04 | 50.042 |
| 1900-02-06 10:56:04 | 50.047 |
| 1900-02-06 11:56:04 | 50.05 |
| 1900-02-06 12:56:04 | 50.053 |
| 1900-02-06 13:56:04 | 50.055 |
| 1900-02-06 14:56:04 | 50.056 |
| 1900-02-06 15:56:04 | 50.055 |
| 1900-02-06 16:56:04 | 50.055 |
| 1900-02-06 17:56:04 | 50.055 |
| 1900-02-06 18:56:04 | 50.056 |
| 1900-02-06 19:56:04 | 50.057 |
| 1900-02-06 20:56:04 | 50.058 |
| 1900-02-06 21:56:04 | 50.059 |
| 1900-02-06 22:56:04 | 50.059 |
| 1900-02-06 23:56:04 | 50.058 |
| 1900-02-07 00:56:04 | 50.06 |
| 1900-02-07 01:56:04 | 50.06 |
| 1900-02-07 02:56:04 | 50.063 |
| 0.8409722222222222 | 50.063 |
| 0.8409837962962964 | 50.063 |
| 0.8409953703703703 | 50.063 |
| 0.8410069444444445 | 50.062 |
| 0.8410185185185185 | 50.06 |
| 0.8410300925925926 | 50.057 |
| 0.8410416666666666 | 50.055 |
| 0.8410532407407407 | 50.056 |
| 0.8410648148148149 | 50.059 |
| 0.8410763888888889 | 50.064 |
| 0.841087962962963 | 50.067 |
| 0.841099537037037 | 50.069 |
| 0.8411111111111111 | 50.069 |
| 0.8411226851851853 | 50.071 |
| 0.8411342592592592 | 50.072 |
| 0.8411458333333334 | 50.073 |
| 0.8411574074074074 | 50.074 |
| 0.8411689814814814 | 50.074 |
| 0.8411805555555555 | 50.073 |
| 0.8411921296296296 | 50.072 |
| 0.8412037037037038 | 50.069 |
| 0.8412152777777777 | 50.07 |
| 0.8412268518518519 | 50.071 |
| 0.8412384259259259 | 50.072 |
| 0.84125 | 50.073 |
| 0.841261574074074 | 50.074 |
| 0.8412731481481481 | 50.075 |
| 0.8412847222222223 | 50.075 |
| 0.8412962962962963 | 50.076 |
| 0.8413078703703704 | 50.077 |
| 0.8413194444444444 | 50.078 |
| 0.8413310185185185 | 50.079 |
| 0.8413425925925927 | 50.08 |
| 0.8413541666666666 | 50.079 |
| 0.8413657407407408 | 50.078 |
| 0.8413773148148148 | 50.077 |
| 0.8413888888888889 | 50.077 |
| 0.8414004629629629 | 50.077 |
| 0.841412037037037 | 50.076 |
| 0.8414236111111112 | 50.076 |
| 0.8414351851851851 | 50.076 |
| 0.8414467592592593 | 50.077 |
| 0.8414583333333333 | 50.079 |
| 0.8414699074074075 | 50.083 |
| 0.8414814814814814 | 50.087 |
| 0.8414930555555555 | 50.087 |
| 0.8415046296296297 | 50.086 |
| 0.8415162037037037 | 50.083 |
| 0.8415277777777778 | 50.081 |
| 0.8415393518518518 | 50.08 |
| 0.841550925925926 | 50.079 |
| 0.8415625000000001 | 50.079 |
| 0.841574074074074 | 50.077 |
| 0.8415856481481482 | 50.074 |
| 0.8415972222222222 | 50.074 |
| 0.8416087962962964 | 50.073 |
| 0.8416203703703703 | 50.07 |
| 0.8416319444444444 | 50.067 |
| 0.8416435185185186 | 50.065 |
| 0.8416550925925925 | 50.065 |
| 0.8416666666666667 | 50.064 |
| 0.8416782407407407 | 50.065 |
| 0.8416898148148149 | 50.066 |
| 0.8417013888888888 | 50.068 |
| 0.8417129629629629 | 50.068 |
| 0.8417245370370371 | 50.068 |
| 0.8417361111111111 | 50.066 |
| 0.8417476851851852 | 50.064 |
| 0.8417592592592592 | 50.064 |
| 0.8417708333333334 | 50.064 |
| 0.8417824074074075 | 50.063 |
| 0.8417939814814814 | 50.063 |
| 0.8418055555555556 | 50.061 |
| 0.8418171296296296 | 50.058 |
| 0.8418287037037038 | 50.056 |
| 0.8418402777777777 | 50.053 |
| 0.8418518518518519 | 50.05 |
| 0.841863425925926 | 50.045 |
| 0.8418749999999999 | 50.044 |
| 0.8418865740740741 | 50.044 |
| 0.8418981481481481 | 50.045 |
| 0.8419097222222223 | 50.045 |
| 0.8419212962962962 | 50.045 |
| 0.8419328703703703 | 50.044 |
| 0.8419444444444445 | 50.044 |
| 0.8419560185185185 | 50.044 |
| 0.8419675925925926 | 50.042 |
| 0.8419791666666666 | 50.041 |
| 0.8419907407407408 | 50.039 |
| 0.8420023148148149 | 50.037 |
| 0.8420138888888888 | 50.036 |
| 0.842025462962963 | 50.035 |
| 0.842037037037037 | 50.036 |
| 0.8420486111111112 | 50.038 |
| 0.8420601851851851 | 50.038 |
| 0.8420717592592593 | 50.038 |
| 0.8420833333333334 | 50.038 |
| 0.8420949074074073 | 50.038 |
| 0.8421064814814815 | 50.04 |
| 0.8421180555555555 | 50.045 |
| 0.8421296296296297 | 50.048 |
| 0.8421412037037036 | 50.051 |
| 0.8421527777777778 | 50.053 |
| 0.8421643518518519 | 50.057 |
| 0.8421759259259259 | 50.061 |
| 0.8421875 | 50.065 |
| 0.842199074074074 | 50.068 |
| 0.8422106481481482 | 50.071 |
| 0.8422222222222223 | 50.072 |
| 0.8422337962962962 | 50.074 |
| 0.8422453703703704 | 50.075 |
| 0.8422569444444444 | 50.075 |
| 0.8422685185185186 | 50.075 |
| 0.8422800925925925 | 50.076 |
| 0.8422916666666667 | 50.078 |
| 0.8423032407407408 | 50.08 |
| 0.8423148148148148 | 50.083 |
| 0.8423263888888889 | 50.085 |
| 0.8423379629629629 | 50.086 |
| 0.8423495370370371 | 50.085 |
| 0.842361111111111 | 50.084 |
| 0.8423726851851852 | 50.084 |
| 0.8423842592592593 | 50.084 |
| 0.8423958333333333 | 50.084 |
| 0.8424074074074074 | 50.086 |
| 0.8424189814814814 | 50.089 |
| 0.8424305555555556 | 50.092 |
| 0.8424421296296297 | 50.094 |
| 0.8424537037037036 | 50.092 |
| 0.8424652777777778 | 50.093 |
| 0.8424768518518518 | 50.09 |
| 0.842488425925926 | 50.091 |
| 0.8424999999999999 | 50.091 |
| 0.8425115740740741 | 50.091 |
| 0.8425231481481482 | 50.09 |
| 0.8425347222222223 | 50.089 |
| 0.8425462962962963 | 50.087 |
| 0.8425578703703703 | 50.085 |
| 0.8425694444444445 | 50.082 |
| 0.8425810185185184 | 50.08 |
| 0.8425925925925926 | 50.073 |
| 0.8426041666666667 | 50.067 |
| 0.8426157407407407 | 50.064 |
| 0.8426273148148148 | 50.062 |
| 0.8426388888888888 | 50.062 |
| 0.842650462962963 | 50.061 |
| 0.8426620370370371 | 50.06 |
| 0.842673611111111 | 50.059 |
| 0.8426851851851852 | 50.058 |
| 0.8426967592592592 | 50.057 |
| 0.8427083333333334 | 50.056 |
| 0.8427199074074073 | 50.054 |
| 0.8427314814814815 | 50.054 |
| 0.8427430555555556 | 50.056 |
| 0.8427546296296297 | 50.057 |
| 0.8427662037037037 | 50.056 |
| 0.8427777777777777 | 50.055 |
| 0.8427893518518519 | 50.054 |
| 0.842800925925926 | 50.055 |
| 0.8428125 | 50.055 |
| 0.8428240740740741 | 50.055 |
| 0.8428356481481482 | 50.055 |
| 0.8428472222222222 | 50.056 |
| 0.8428587962962962 | 50.056 |
| 0.8428703703703704 | 50.056 |
| 0.8428819444444445 | 50.056 |
| 0.8428935185185185 | 50.056 |
| 0.8429050925925926 | 50.056 |
| 0.8429166666666666 | 50.054 |
| 0.8429282407407408 | 50.05 |
| 0.8429398148148147 | 50.047 |
| 0.8429513888888889 | 50.045 |
| 0.842962962962963 | 50.045 |
| 0.8429745370370371 | 50.046 |
| 0.8429861111111111 | 50.048 |
| 0.8429976851851851 | 50.049 |
| 0.8430092592592593 | 50.05 |
| 0.8430208333333334 | 50.05 |
| 0.8430324074074074 | 50.049 |
| 0.8430439814814815 | 50.049 |
| 0.8430555555555556 | 50.048 |
| 0.8430671296296296 | 50.048 |
| 0.8430787037037036 | 50.048 |
| 0.8430902777777778 | 50.05 |
| 0.8431018518518519 | 50.054 |
| 0.8431134259259259 | 50.056 |
| 0.843125 | 50.057 |
| 0.843136574074074 | 50.059 |
| 0.8431481481481482 | 50.061 |
| 0.8431597222222221 | 50.06 |
| 0.8431712962962963 | 50.059 |
| 0.8431828703703704 | 50.057 |
| 0.8431944444444445 | 50.058 |
| 0.8432060185185185 | 50.06 |
| 0.8432175925925925 | 50.061 |
| 0.8432291666666667 | 50.063 |
| 0.8432407407407408 | 50.065 |
| 0.8432523148148148 | 50.067 |
| 0.8432638888888889 | 50.07 |
| 0.843275462962963 | 50.07 |
| 0.843287037037037 | 50.066 |
| 0.843298611111111 | 50.064 |
| 0.8433101851851852 | 50.064 |
| 0.8433217592592593 | 50.067 |
| 0.8433333333333333 | 50.072 |
| 0.8433449074074074 | 50.075 |
| 0.8433564814814815 | 50.077 |
| 0.8433680555555556 | 50.079 |
| 0.8433796296296295 | 50.081 |
| 0.8433912037037037 | 50.082 |
| 0.8434027777777778 | 50.082 |
| 0.8434143518518519 | 50.082 |
| 0.8434259259259259 | 50.081 |
| 0.8434375 | 50.079 |
| 0.8434490740740741 | 50.078 |
| 0.8434606481481483 | 50.075 |
| 0.8434722222222222 | 50.073 |
| 0.8434837962962963 | 50.072 |
| 0.8434953703703704 | 50.075 |
| 0.8435069444444445 | 50.076 |
| 0.8435185185185184 | 50.075 |
| 0.8435300925925926 | 50.073 |
| 0.8435416666666667 | 50.07 |
| 0.8435532407407407 | 50.066 |
| 0.8435648148148148 | 50.064 |
| 0.8435763888888889 | 50.058 |
| 0.843587962962963 | 50.052 |
| 0.8435995370370369 | 50.046 |
| 0.8436111111111111 | 50.043 |
| 0.8436226851851852 | 50.041 |
| 0.8436342592592593 | 50.041 |
| 0.8436458333333333 | 50.039 |
| 0.8436574074074074 | 50.037 |
| 0.8436689814814815 | 50.035 |
| 0.8436805555555557 | 50.033 |
| 0.8436921296296296 | 50.035 |
| 0.8437037037037037 | 50.035 |
| 0.8437152777777778 | 50.037 |
| 0.8437268518518519 | 50.035 |
| 0.8437384259259259 | 50.031 |
| 0.84375 | 50.029 |
| 0.8437615740740741 | 50.025 |
| 0.8437731481481481 | 50.022 |
| 0.8437847222222222 | 50.02 |
| 0.8437962962962963 | 50.021 |
| 0.8438078703703704 | 50.019 |
| 0.8438194444444443 | 50.019 |
| 0.8438310185185185 | 50.019 |
| 0.8438425925925926 | 50.021 |
| 0.8438541666666667 | 50.023 |
| 0.8438657407407407 | 50.026 |
| 0.8438773148148148 | 50.027 |
| 0.8438888888888889 | 50.029 |
| 0.8439004629629631 | 50.03 |
| 0.843912037037037 | 50.032 |
| 0.8439236111111111 | 50.035 |
| 0.8439351851851852 | 50.037 |
| 0.8439467592592593 | 50.039 |
| 0.8439583333333333 | 50.039 |
| 0.8439699074074074 | 50.038 |
| 0.8439814814814816 | 50.037 |
| 0.8439930555555555 | 50.036 |
| 0.8440046296296296 | 50.035 |
| 0.8440162037037037 | 50.035 |
| 0.8440277777777778 | 50.034 |
| 0.8440393518518517 | 50.034 |
| 0.8440509259259259 | 50.035 |
| 0.8440625 | 50.037 |
| 0.8440740740740741 | 50.041 |
| 0.8440856481481481 | 50.045 |
| 0.8440972222222222 | 50.049 |
| 0.8441087962962963 | 50.051 |
| 0.8441203703703705 | 50.052 |
| 0.8441319444444444 | 50.051 |
| 0.8441435185185185 | 50.053 |
| 0.8441550925925926 | 50.055 |
| 0.8441666666666667 | 50.057 |
| 0.8441782407407407 | 50.059 |
| 0.8441898148148148 | 50.06 |
| 0.844201388888889 | 50.064 |
| 0.844212962962963 | 50.067 |
| 0.844224537037037 | 50.068 |
| 0.8442361111111111 | 50.068 |
| 0.8442476851851852 | 50.067 |
| 0.8442592592592592 | 50.064 |
| 0.8442708333333333 | 50.06 |
| 0.8442824074074075 | 50.057 |
| 0.8442939814814815 | 50.054 |
| 0.8443055555555555 | 50.053 |
| 0.8443171296296296 | 50.054 |
| 0.8443287037037037 | 50.053 |
| 0.8443402777777779 | 50.054 |
| 0.8443518518518518 | 50.056 |
| 0.844363425925926 | 50.055 |
| 0.844375 | 50.052 |
| 0.8443865740740741 | 50.051 |
| 0.8443981481481481 | 50.051 |
| 0.8444097222222222 | 50.051 |
| 0.8444212962962964 | 50.051 |
| 0.8444328703703704 | 50.051 |
| 0.8444444444444444 | 50.051 |
| 0.8444560185185185 | 50.052 |
| 0.8444675925925926 | 50.053 |
| 0.8444791666666666 | 50.054 |
| 0.8444907407407407 | 50.055 |
| 0.8445023148148149 | 50.055 |
| 0.8445138888888889 | 50.052 |
| 0.8445254629629629 | 50.049 |
| 0.844537037037037 | 50.047 |
| 0.8445486111111111 | 50.046 |
| 0.8445601851851853 | 50.05 |
| 0.8445717592592592 | 50.051 |
| 0.8445833333333334 | 50.053 |
| 0.8445949074074074 | 50.055 |
| 0.8446064814814815 | 50.056 |
| 0.8446180555555555 | 50.057 |
| 0.8446296296296296 | 50.059 |
| 0.8446412037037038 | 50.06 |
| 0.8446527777777778 | 50.059 |
| 0.8446643518518518 | 50.059 |
| 0.8446759259259259 | 50.063 |
| 0.8446875 | 50.064 |
| 0.844699074074074 | 50.064 |
| 0.8447106481481481 | 50.062 |
| 0.8447222222222223 | 50.062 |
| 0.8447337962962963 | 50.062 |
| 0.8447453703703703 | 50.061 |
| 0.8447569444444444 | 50.063 |
| 0.8447685185185185 | 50.063 |
| 0.8447800925925927 | 50.064 |
| 0.8447916666666666 | 50.064 |
| 0.8448032407407408 | 50.063 |
| 0.8448148148148148 | 50.063 |
| 0.844826388888889 | 50.064 |
| 0.8448379629629629 | 50.066 |
| 0.844849537037037 | 50.065 |
| 0.8448611111111112 | 50.065 |
| 0.8448726851851852 | 50.063 |
| 0.8448842592592593 | 50.062 |
| 0.8448958333333333 | 50.061 |
| 0.8449074074074074 | 50.062 |
| 0.8449189814814816 | 50.062 |
| 0.8449305555555555 | 50.061 |
| 0.8449421296296297 | 50.062 |
| 0.8449537037037037 | 50.063 |
| 0.8449652777777777 | 50.067 |
| 0.8449768518518518 | 50.07 |
| 0.8449884259259259 | 50.073 |
| 0.8450000000000001 | 50.074 |
| 0.845011574074074 | 50.073 |
| 0.8450231481481482 | 50.072 |
| 0.8450347222222222 | 50.07 |
| 0.8450462962962964 | 50.068 |
| 0.8450578703703703 | 50.067 |
| 0.8450694444444444 | 50.065 |
| 0.8450810185185186 | 50.064 |
| 0.8450925925925926 | 50.061 |
| 0.8451041666666667 | 50.058 |
| 0.8451157407407407 | 50.054 |
| 0.8451273148148148 | 50.05 |
| 0.845138888888889 | 50.046 |
| 0.8451504629629629 | 50.044 |
| 0.8451620370370371 | 50.041 |
| 0.8451736111111111 | 50.037 |
| 0.8451851851851852 | 50.033 |
| 0.8451967592592592 | 50.031 |
| 0.8452083333333333 | 50.03 |
| 0.8452199074074075 | 50.032 |
| 0.8452314814814814 | 50.035 |
| 0.8452430555555556 | 50.037 |
| 0.8452546296296296 | 50.035 |
| 0.8452662037037038 | 50.038 |
| 0.8452777777777777 | 50.038 |
| 0.8452893518518518 | 50.041 |
| 0.845300925925926 | 50.041 |
| 0.8453125 | 50.043 |
| 0.8453240740740741 | 50.044 |
| 0.8453356481481481 | 50.042 |
| 0.8453472222222222 | 50.038 |
| 0.8453587962962964 | 50.035 |
| 0.8453703703703703 | 50.032 |
| 0.8453819444444445 | 50.031 |
| 0.8453935185185185 | 50.03 |
| 0.8454050925925927 | 50.03 |
| 0.8454166666666666 | 50.029 |
| 0.8454282407407407 | 50.029 |
| 0.8454398148148149 | 50.028 |
| 0.8454513888888888 | 50.027 |
| 0.845462962962963 | 50.025 |
| 0.845474537037037 | 50.02 |
| 0.8454861111111112 | 50.017 |
| 0.8454976851851851 | 50.014 |
| 0.8455092592592592 | 50.013 |
| 0.8455208333333334 | 50.012 |
| 0.8455324074074074 | 50.011 |
| 0.8455439814814815 | 50.009 |
| 0.8455555555555555 | 50.01 |
| 0.8455671296296297 | 50.012 |
| 0.8455787037037038 | 50.016 |
| 0.8455902777777777 | 50.02 |
| 0.8456018518518519 | 50.023 |
| 0.8456134259259259 | 50.024 |
| 0.8456250000000001 | 50.029 |
| 0.845636574074074 | 50.037 |
| 0.8456481481481481 | 50.044 |
| 0.8456597222222223 | 50.049 |
| 0.8456712962962962 | 50.051 |
| 0.8456828703703704 | 50.054 |
| 0.8456944444444444 | 50.057 |
| 0.8457060185185186 | 50.059 |
| 0.8457175925925925 | 50.06 |
| 0.8457291666666666 | 50.061 |
| 0.8457407407407408 | 50.065 |
| 0.8457523148148148 | 50.069 |
| 0.8457638888888889 | 50.071 |
| 0.8457754629629629 | 50.075 |
| 0.8457870370370371 | 50.076 |
| 0.8457986111111112 | 50.078 |
| 0.8458101851851851 | 50.082 |
| 0.8458217592592593 | 50.084 |
| 0.8458333333333333 | 50.084 |
| 0.8458449074074075 | 50.082 |
| 0.8458564814814814 | 50.083 |
| 0.8458680555555556 | 50.082 |
| 0.8458796296296297 | 50.081 |
| 0.8458912037037036 | 50.077 |
| 0.8459027777777778 | 50.074 |
| 0.8459143518518518 | 50.071 |
| 0.845925925925926 | 50.069 |
| 0.8459374999999999 | 50.066 |
| 0.845949074074074 | 50.063 |
| 0.8459606481481482 | 50.06 |
| 0.8459722222222222 | 50.058 |
| 0.8459837962962963 | 50.057 |
| 0.8459953703703703 | 50.055 |
| 0.8460069444444445 | 50.053 |
| 0.8460185185185186 | 50.052 |
| 0.8460300925925925 | 50.051 |
| 0.8460416666666667 | 50.05 |
| 0.8460532407407407 | 50.047 |
| 0.8460648148148149 | 50.045 |
| 0.8460763888888888 | 50.044 |
| 0.846087962962963 | 50.047 |
| 0.8460995370370371 | 50.05 |
| 0.846111111111111 | 50.054 |
| 0.8461226851851852 | 50.058 |
| 0.8461342592592592 | 50.061 |
| 0.8461458333333334 | 50.066 |
| 0.8461574074074073 | 50.068 |
| 0.8461689814814815 | 50.069 |
| 0.8461805555555556 | 50.071 |
| 0.8461921296296296 | 50.07 |
| 0.8462037037037037 | 50.069 |
| 0.8462152777777777 | 50.065 |
| 0.8462268518518519 | 50.062 |
| 0.846238425925926 | 50.059 |
| 0.84625 | 50.054 |
| 0.8462615740740741 | 50.054 |
| 0.8462731481481481 | 50.053 |
| 0.8462847222222223 | 50.052 |
| 0.8462962962962962 | 50.053 |
| 0.8463078703703704 | 50.051 |
| 0.8463194444444445 | 50.051 |
| 0.8463310185185186 | 50.051 |
| 0.8463425925925926 | 50.053 |
| 0.8463541666666666 | 50.058 |
| 0.8463657407407408 | 50.063 |
| 0.8463773148148147 | 50.069 |
| 0.8463888888888889 | 50.072 |
| 0.846400462962963 | 50.076 |
| 0.846412037037037 | 50.078 |
| 0.8464236111111111 | 50.081 |
| 0.8464351851851851 | 50.085 |
| 0.8464467592592593 | 50.088 |
| 0.8464583333333334 | 50.087 |
| 0.8464699074074074 | 50.089 |
| 0.8464814814814815 | 50.093 |
| 0.8464930555555555 | 50.094 |
| 0.8465046296296297 | 50.094 |
| 0.8465162037037036 | 50.094 |
| 0.8465277777777778 | 50.097 |
| 0.8465393518518519 | 50.097 |
| 0.846550925925926 | 50.096 |
| 0.8465625 | 50.095 |
| 0.846574074074074 | 50.095 |
| 0.8465856481481482 | 50.096 |
| 0.8465972222222223 | 50.097 |
| 0.8466087962962963 | 50.095 |
| 0.8466203703703704 | 50.089 |
| 0.8466319444444445 | 50.085 |
| 0.8466435185185185 | 50.078 |
| 0.8466550925925925 | 50.073 |
| 0.8466666666666667 | 50.071 |
| 0.8466782407407408 | 50.069 |
| 0.8466898148148148 | 50.068 |
| 0.8467013888888889 | 50.068 |
| 0.846712962962963 | 50.068 |
| 0.8467245370370371 | 50.066 |
| 0.846736111111111 | 50.064 |
| 0.8467476851851852 | 50.063 |
| 0.8467592592592593 | 50.06 |
| 0.8467708333333334 | 50.058 |
| 0.8467824074074074 | 50.056 |
| 0.8467939814814814 | 50.052 |
| 0.8468055555555556 | 50.048 |
| 0.8468171296296297 | 50.047 |
| 0.8468287037037037 | 50.047 |
| 0.8468402777777778 | 50.047 |
| 0.8468518518518519 | 50.051 |
| 0.8468634259259259 | 50.053 |
| 0.8468749999999999 | 50.055 |
| 0.8468865740740741 | 50.056 |
| 0.8468981481481482 | 50.057 |
| 0.8469097222222222 | 50.058 |
| 0.8469212962962963 | 50.059 |
| 0.8469328703703703 | 50.058 |
| 0.8469444444444445 | 50.058 |
| 0.8469560185185184 | 50.057 |
| 0.8469675925925926 | 50.055 |
| 0.8469791666666667 | 50.056 |
| 0.8469907407407408 | 50.061 |
| 0.8470023148148148 | 50.063 |
| 0.8470138888888888 | 50.066 |
| 0.847025462962963 | 50.068 |
| 0.8470370370370371 | 50.069 |
| 0.8470486111111111 | 50.072 |
| 0.8470601851851852 | 50.074 |
| 0.8470717592592593 | 50.076 |
| 0.8470833333333333 | 50.078 |
| 0.8470949074074073 | 50.075 |
| 0.8471064814814815 | 50.073 |
| 0.8471180555555556 | 50.072 |
| 0.8471296296296296 | 50.07 |
| 0.8471412037037037 | 50.069 |
| 0.8471527777777778 | 50.069 |
| 0.8471643518518519 | 50.071 |
| 0.8471759259259258 | 50.073 |
| 0.8471875 | 50.077 |
| 0.8471990740740741 | 50.077 |
| 0.8472106481481482 | 50.078 |